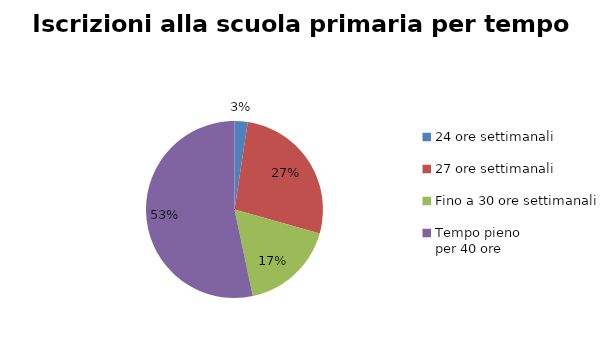
| Category | Series 1 | Series 0 |
|---|---|---|
| 24 ore settimanali | 892 | 892 |
| 27 ore settimanali | 9998 | 9998 |
| Fino a 30 ore settimanali | 6413 | 6413 |
| Tempo pieno 
per 40 ore | 19762 | 19762 |